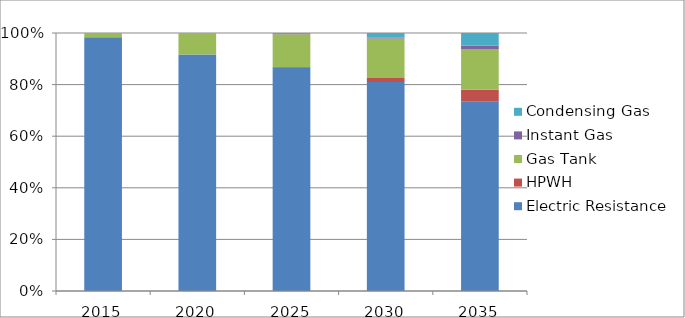
| Category | Electric Resistance | HPWH | Gas Tank | Instant Gas | Condensing Gas |
|---|---|---|---|---|---|
| 2015.0 | 0.984 | 0 | 0.016 | 0 | 0 |
| 2020.0 | 0.917 | 0 | 0.083 | 0 | 0 |
| 2025.0 | 0.865 | 0.003 | 0.127 | 0.001 | 0.004 |
| 2030.0 | 0.81 | 0.016 | 0.152 | 0.005 | 0.017 |
| 2035.0 | 0.736 | 0.044 | 0.159 | 0.013 | 0.049 |